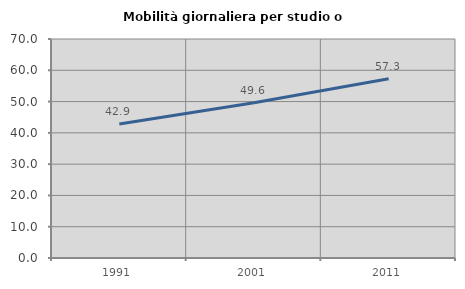
| Category | Mobilità giornaliera per studio o lavoro |
|---|---|
| 1991.0 | 42.857 |
| 2001.0 | 49.6 |
| 2011.0 | 57.273 |